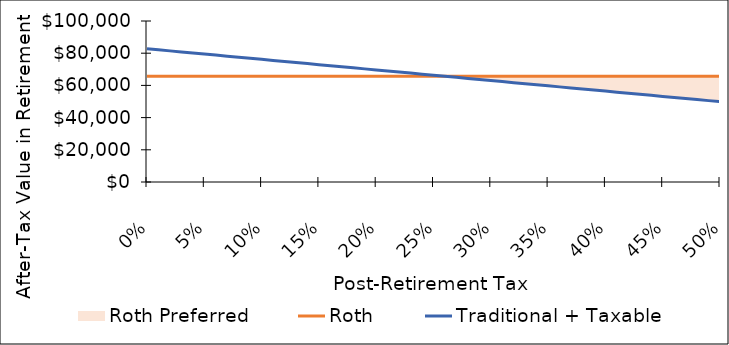
| Category | Roth | Traditional + Taxable |
|---|---|---|
| 0.0 | 65746.277 | 82755.384 |
| 0.01 | 65746.277 | 82097.921 |
| 0.02 | 65746.277 | 81440.458 |
| 0.03 | 65746.277 | 80782.995 |
| 0.04 | 65746.277 | 80125.533 |
| 0.05 | 65746.277 | 79468.07 |
| 0.060000000000000005 | 65746.277 | 78810.607 |
| 0.07 | 65746.277 | 78153.144 |
| 0.08 | 65746.277 | 77495.682 |
| 0.09 | 65746.277 | 76838.219 |
| 0.09999999999999999 | 65746.277 | 76180.756 |
| 0.10999999999999999 | 65746.277 | 75523.293 |
| 0.11999999999999998 | 65746.277 | 74865.83 |
| 0.12999999999999998 | 65746.277 | 74208.368 |
| 0.13999999999999999 | 65746.277 | 73550.905 |
| 0.15 | 65746.277 | 72893.442 |
| 0.16 | 65746.277 | 72235.979 |
| 0.17 | 65746.277 | 71578.517 |
| 0.18000000000000002 | 65746.277 | 70921.054 |
| 0.19000000000000003 | 65746.277 | 70263.591 |
| 0.20000000000000004 | 65746.277 | 69606.128 |
| 0.21000000000000005 | 65746.277 | 68948.665 |
| 0.22000000000000006 | 65746.277 | 68291.203 |
| 0.23000000000000007 | 65746.277 | 67633.74 |
| 0.24000000000000007 | 65746.277 | 66976.277 |
| 0.25000000000000006 | 65746.277 | 66318.814 |
| 0.26000000000000006 | 65746.277 | 65661.352 |
| 0.2700000000000001 | 65746.277 | 65003.889 |
| 0.2800000000000001 | 65746.277 | 64346.426 |
| 0.2900000000000001 | 65746.277 | 63688.963 |
| 0.3000000000000001 | 65746.277 | 63031.501 |
| 0.3100000000000001 | 65746.277 | 62374.038 |
| 0.3200000000000001 | 65746.277 | 61716.575 |
| 0.3300000000000001 | 65746.277 | 61059.112 |
| 0.34000000000000014 | 65746.277 | 60401.649 |
| 0.35000000000000014 | 65746.277 | 59744.187 |
| 0.36000000000000015 | 65746.277 | 59086.724 |
| 0.37000000000000016 | 65746.277 | 58429.261 |
| 0.38000000000000017 | 65746.277 | 57771.798 |
| 0.3900000000000002 | 65746.277 | 57114.336 |
| 0.4000000000000002 | 65746.277 | 56456.873 |
| 0.4100000000000002 | 65746.277 | 55799.41 |
| 0.4200000000000002 | 65746.277 | 55141.947 |
| 0.4300000000000002 | 65746.277 | 54484.485 |
| 0.4400000000000002 | 65746.277 | 53827.022 |
| 0.45000000000000023 | 65746.277 | 53169.559 |
| 0.46000000000000024 | 65746.277 | 52512.096 |
| 0.47000000000000025 | 65746.277 | 51854.633 |
| 0.48000000000000026 | 65746.277 | 51197.171 |
| 0.49000000000000027 | 65746.277 | 50539.708 |
| 0.5000000000000002 | 65746.277 | 49882.245 |